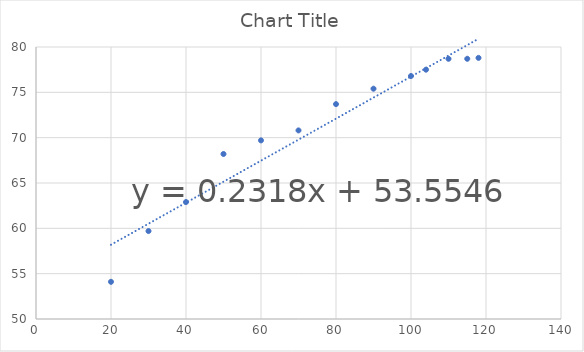
| Category | Series 0 |
|---|---|
| 20.0 | 54.1 |
| 30.0 | 59.7 |
| 40.0 | 62.9 |
| 50.0 | 68.2 |
| 60.0 | 69.7 |
| 70.0 | 70.8 |
| 80.0 | 73.7 |
| 90.0 | 75.4 |
| 100.0 | 76.8 |
| 104.0 | 77.5 |
| 110.0 | 78.7 |
| 115.0 | 78.7 |
| 118.0 | 78.8 |